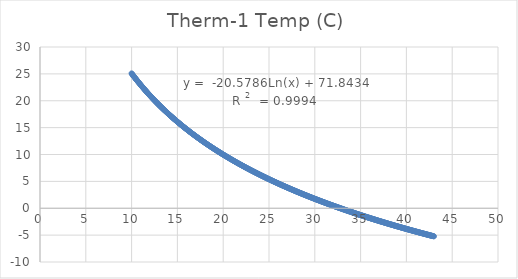
| Category | Therm-1 Temp (C)  |
|---|---|
| 10.0 | 25.089 |
| 10.05 | 24.975 |
| 10.1 | 24.862 |
| 10.15 | 24.75 |
| 10.2 | 24.638 |
| 10.25 | 24.527 |
| 10.3 | 24.417 |
| 10.35 | 24.307 |
| 10.4 | 24.197 |
| 10.45 | 24.089 |
| 10.5 | 23.98 |
| 10.55 | 23.873 |
| 10.6 | 23.766 |
| 10.65 | 23.659 |
| 10.7 | 23.554 |
| 10.75 | 23.448 |
| 10.8 | 23.344 |
| 10.85 | 23.239 |
| 10.9 | 23.136 |
| 10.95 | 23.033 |
| 11.0 | 22.93 |
| 11.05 | 22.828 |
| 11.1 | 22.726 |
| 11.15 | 22.625 |
| 11.2 | 22.525 |
| 11.25 | 22.425 |
| 11.3 | 22.325 |
| 11.35 | 22.226 |
| 11.4 | 22.128 |
| 11.45 | 22.03 |
| 11.5 | 21.932 |
| 11.55 | 21.835 |
| 11.6 | 21.739 |
| 11.65 | 21.643 |
| 11.7 | 21.547 |
| 11.75 | 21.452 |
| 11.8 | 21.357 |
| 11.85 | 21.263 |
| 11.9 | 21.169 |
| 11.95 | 21.076 |
| 12.0 | 20.983 |
| 12.05 | 20.89 |
| 12.1 | 20.798 |
| 12.15 | 20.706 |
| 12.2 | 20.615 |
| 12.25 | 20.524 |
| 12.3 | 20.434 |
| 12.35 | 20.344 |
| 12.4 | 20.255 |
| 12.45 | 20.165 |
| 12.5 | 20.077 |
| 12.55 | 19.988 |
| 12.6 | 19.9 |
| 12.65 | 19.813 |
| 12.7 | 19.726 |
| 12.75 | 19.639 |
| 12.8 | 19.553 |
| 12.85 | 19.467 |
| 12.9 | 19.381 |
| 12.95 | 19.296 |
| 13.0 | 19.211 |
| 13.05 | 19.126 |
| 13.1 | 19.042 |
| 13.15 | 18.958 |
| 13.2 | 18.875 |
| 13.25 | 18.792 |
| 13.3 | 18.709 |
| 13.35 | 18.627 |
| 13.4 | 18.545 |
| 13.45 | 18.463 |
| 13.5 | 18.382 |
| 13.55 | 18.301 |
| 13.6 | 18.22 |
| 13.65 | 18.14 |
| 13.7 | 18.06 |
| 13.75 | 17.98 |
| 13.8 | 17.901 |
| 13.85 | 17.822 |
| 13.9 | 17.743 |
| 13.95 | 17.665 |
| 14.0 | 17.587 |
| 14.05 | 17.509 |
| 14.1 | 17.432 |
| 14.15 | 17.355 |
| 14.2 | 17.278 |
| 14.25 | 17.201 |
| 14.3 | 17.125 |
| 14.35 | 17.049 |
| 14.4 | 16.974 |
| 14.45 | 16.898 |
| 14.5 | 16.823 |
| 14.55 | 16.749 |
| 14.6 | 16.674 |
| 14.65 | 16.6 |
| 14.7 | 16.526 |
| 14.75 | 16.453 |
| 14.8 | 16.379 |
| 14.85 | 16.306 |
| 14.9 | 16.234 |
| 14.95 | 16.161 |
| 15.0 | 16.089 |
| 15.05 | 16.017 |
| 15.1 | 15.945 |
| 15.15 | 15.874 |
| 15.2 | 15.803 |
| 15.25 | 15.732 |
| 15.3 | 15.662 |
| 15.35 | 15.591 |
| 15.4 | 15.521 |
| 15.45 | 15.451 |
| 15.5 | 15.382 |
| 15.55 | 15.313 |
| 15.6 | 15.244 |
| 15.65 | 15.175 |
| 15.7 | 15.106 |
| 15.75 | 15.038 |
| 15.8 | 14.97 |
| 15.85 | 14.902 |
| 15.9 | 14.834 |
| 15.95 | 14.767 |
| 16.0 | 14.7 |
| 16.05 | 14.633 |
| 16.1 | 14.567 |
| 16.15 | 14.5 |
| 16.2 | 14.434 |
| 16.25 | 14.368 |
| 16.3 | 14.302 |
| 16.35 | 14.237 |
| 16.4 | 14.172 |
| 16.45 | 14.107 |
| 16.5 | 14.042 |
| 16.55 | 13.977 |
| 16.6 | 13.913 |
| 16.65 | 13.849 |
| 16.7 | 13.785 |
| 16.75 | 13.721 |
| 16.8 | 13.658 |
| 16.85 | 13.594 |
| 16.9 | 13.531 |
| 16.95 | 13.468 |
| 17.0 | 13.406 |
| 17.05 | 13.343 |
| 17.1 | 13.281 |
| 17.15 | 13.219 |
| 17.2 | 13.157 |
| 17.25 | 13.095 |
| 17.3 | 13.034 |
| 17.35 | 12.973 |
| 17.4 | 12.912 |
| 17.45 | 12.851 |
| 17.5 | 12.79 |
| 17.55 | 12.73 |
| 17.6 | 12.67 |
| 17.65 | 12.61 |
| 17.7 | 12.55 |
| 17.75 | 12.49 |
| 17.8 | 12.431 |
| 17.85 | 12.371 |
| 17.9 | 12.312 |
| 17.95 | 12.253 |
| 18.0 | 12.195 |
| 18.05 | 12.136 |
| 18.1 | 12.078 |
| 18.15 | 12.019 |
| 18.2 | 11.961 |
| 18.25 | 11.904 |
| 18.3 | 11.846 |
| 18.35 | 11.788 |
| 18.4 | 11.731 |
| 18.45 | 11.674 |
| 18.5 | 11.617 |
| 18.55 | 11.56 |
| 18.6 | 11.504 |
| 18.65 | 11.447 |
| 18.7 | 11.391 |
| 18.75 | 11.335 |
| 18.8 | 11.279 |
| 18.85 | 11.223 |
| 18.9 | 11.168 |
| 18.95 | 11.112 |
| 19.0 | 11.057 |
| 19.05 | 11.002 |
| 19.1 | 10.947 |
| 19.15 | 10.892 |
| 19.2 | 10.838 |
| 19.25 | 10.783 |
| 19.3 | 10.729 |
| 19.35 | 10.675 |
| 19.4 | 10.621 |
| 19.45 | 10.567 |
| 19.5 | 10.513 |
| 19.55 | 10.46 |
| 19.6 | 10.406 |
| 19.65 | 10.353 |
| 19.7 | 10.3 |
| 19.75 | 10.247 |
| 19.8 | 10.195 |
| 19.85 | 10.142 |
| 19.9 | 10.09 |
| 19.95 | 10.037 |
| 20.0 | 9.985 |
| 20.05 | 9.933 |
| 20.1 | 9.881 |
| 20.15 | 9.83 |
| 20.2 | 9.778 |
| 20.25 | 9.727 |
| 20.3 | 9.675 |
| 20.35 | 9.624 |
| 20.4 | 9.573 |
| 20.45 | 9.522 |
| 20.5 | 9.472 |
| 20.55 | 9.421 |
| 20.6 | 9.371 |
| 20.65 | 9.32 |
| 20.7 | 9.27 |
| 20.75 | 9.22 |
| 20.8 | 9.17 |
| 20.85 | 9.12 |
| 20.9 | 9.071 |
| 20.95 | 9.021 |
| 21.0 | 8.972 |
| 21.05 | 8.923 |
| 21.1 | 8.874 |
| 21.15 | 8.825 |
| 21.2 | 8.776 |
| 21.25 | 8.727 |
| 21.3 | 8.679 |
| 21.35 | 8.63 |
| 21.4 | 8.582 |
| 21.45 | 8.534 |
| 21.5 | 8.485 |
| 21.55 | 8.438 |
| 21.6 | 8.39 |
| 21.65 | 8.342 |
| 21.7 | 8.294 |
| 21.75 | 8.247 |
| 21.8 | 8.2 |
| 21.85 | 8.153 |
| 21.9 | 8.105 |
| 21.95 | 8.058 |
| 22.0 | 8.012 |
| 22.05 | 7.965 |
| 22.1 | 7.918 |
| 22.15 | 7.872 |
| 22.2 | 7.826 |
| 22.25 | 7.779 |
| 22.3 | 7.733 |
| 22.35 | 7.687 |
| 22.4 | 7.641 |
| 22.45 | 7.595 |
| 22.5 | 7.55 |
| 22.55 | 7.504 |
| 22.6 | 7.459 |
| 22.65 | 7.413 |
| 22.7 | 7.368 |
| 22.75 | 7.323 |
| 22.8 | 7.278 |
| 22.85 | 7.233 |
| 22.9 | 7.189 |
| 22.95 | 7.144 |
| 23.0 | 7.099 |
| 23.05 | 7.055 |
| 23.1 | 7.011 |
| 23.15 | 6.966 |
| 23.2 | 6.922 |
| 23.25 | 6.878 |
| 23.3 | 6.834 |
| 23.35 | 6.791 |
| 23.4 | 6.747 |
| 23.45 | 6.703 |
| 23.5 | 6.66 |
| 23.55 | 6.616 |
| 23.6 | 6.573 |
| 23.65 | 6.53 |
| 23.7 | 6.487 |
| 23.75 | 6.444 |
| 23.8 | 6.401 |
| 23.85 | 6.358 |
| 23.9 | 6.316 |
| 23.95 | 6.273 |
| 24.0 | 6.231 |
| 24.05 | 6.188 |
| 24.1 | 6.146 |
| 24.15 | 6.104 |
| 24.2 | 6.062 |
| 24.25 | 6.02 |
| 24.3 | 5.978 |
| 24.35 | 5.936 |
| 24.4 | 5.894 |
| 24.45 | 5.853 |
| 24.5 | 5.811 |
| 24.55 | 5.77 |
| 24.6 | 5.729 |
| 24.65 | 5.688 |
| 24.7 | 5.646 |
| 24.75 | 5.605 |
| 24.8 | 5.564 |
| 24.85 | 5.524 |
| 24.9 | 5.483 |
| 24.95 | 5.442 |
| 25.0 | 5.402 |
| 25.05 | 5.361 |
| 25.1 | 5.321 |
| 25.15 | 5.281 |
| 25.2 | 5.24 |
| 25.25 | 5.2 |
| 25.3 | 5.16 |
| 25.35 | 5.12 |
| 25.4 | 5.081 |
| 25.45 | 5.041 |
| 25.5 | 5.001 |
| 25.55 | 4.962 |
| 25.6 | 4.922 |
| 25.65 | 4.883 |
| 25.7 | 4.843 |
| 25.75 | 4.804 |
| 25.8 | 4.765 |
| 25.85 | 4.726 |
| 25.9 | 4.687 |
| 25.95 | 4.648 |
| 26.0 | 4.609 |
| 26.05 | 4.571 |
| 26.1 | 4.532 |
| 26.15 | 4.493 |
| 26.2 | 4.455 |
| 26.25 | 4.417 |
| 26.3 | 4.378 |
| 26.35 | 4.34 |
| 26.4 | 4.302 |
| 26.45 | 4.264 |
| 26.5 | 4.226 |
| 26.55 | 4.188 |
| 26.6 | 4.15 |
| 26.65 | 4.112 |
| 26.7 | 4.075 |
| 26.75 | 4.037 |
| 26.8 | 4 |
| 26.85 | 3.962 |
| 26.9 | 3.925 |
| 26.95 | 3.888 |
| 27.0 | 3.85 |
| 27.05 | 3.813 |
| 27.1 | 3.776 |
| 27.15 | 3.739 |
| 27.2 | 3.702 |
| 27.25 | 3.666 |
| 27.3 | 3.629 |
| 27.35 | 3.592 |
| 27.4 | 3.556 |
| 27.45 | 3.519 |
| 27.5 | 3.483 |
| 27.55 | 3.446 |
| 27.6 | 3.41 |
| 27.65 | 3.374 |
| 27.7 | 3.338 |
| 27.75 | 3.302 |
| 27.8 | 3.266 |
| 27.85 | 3.23 |
| 27.9 | 3.194 |
| 27.95 | 3.158 |
| 28.0 | 3.122 |
| 28.05 | 3.087 |
| 28.1 | 3.051 |
| 28.15 | 3.016 |
| 28.2 | 2.98 |
| 28.25 | 2.945 |
| 28.3 | 2.91 |
| 28.35 | 2.875 |
| 28.4 | 2.839 |
| 28.45 | 2.804 |
| 28.5 | 2.769 |
| 28.55 | 2.734 |
| 28.6 | 2.7 |
| 28.65 | 2.665 |
| 28.7 | 2.63 |
| 28.75 | 2.595 |
| 28.8 | 2.561 |
| 28.85 | 2.526 |
| 28.9 | 2.492 |
| 28.95 | 2.458 |
| 29.0 | 2.423 |
| 29.05 | 2.389 |
| 29.1 | 2.355 |
| 29.15 | 2.321 |
| 29.2 | 2.287 |
| 29.25 | 2.253 |
| 29.3 | 2.219 |
| 29.35 | 2.185 |
| 29.4 | 2.151 |
| 29.45 | 2.117 |
| 29.5 | 2.084 |
| 29.55 | 2.05 |
| 29.6 | 2.017 |
| 29.65 | 1.983 |
| 29.7 | 1.95 |
| 29.75 | 1.916 |
| 29.8 | 1.883 |
| 29.85 | 1.85 |
| 29.9 | 1.817 |
| 29.95 | 1.784 |
| 30.0 | 1.751 |
| 30.05 | 1.718 |
| 30.1 | 1.685 |
| 30.15 | 1.652 |
| 30.2 | 1.619 |
| 30.25 | 1.586 |
| 30.3 | 1.554 |
| 30.35 | 1.521 |
| 30.4 | 1.488 |
| 30.45 | 1.456 |
| 30.5 | 1.424 |
| 30.55 | 1.391 |
| 30.6 | 1.359 |
| 30.65 | 1.327 |
| 30.7 | 1.294 |
| 30.75 | 1.262 |
| 30.8 | 1.23 |
| 30.85 | 1.198 |
| 30.9 | 1.166 |
| 30.95 | 1.134 |
| 31.0 | 1.103 |
| 31.05 | 1.071 |
| 31.1 | 1.039 |
| 31.15 | 1.007 |
| 31.2 | 0.976 |
| 31.25 | 0.944 |
| 31.3 | 0.913 |
| 31.35 | 0.881 |
| 31.4 | 0.85 |
| 31.45 | 0.819 |
| 31.5 | 0.787 |
| 31.55 | 0.756 |
| 31.6 | 0.725 |
| 31.65 | 0.694 |
| 31.7 | 0.663 |
| 31.75 | 0.632 |
| 31.8 | 0.601 |
| 31.85 | 0.57 |
| 31.9 | 0.539 |
| 31.95 | 0.508 |
| 32.0 | 0.478 |
| 32.05 | 0.447 |
| 32.1 | 0.416 |
| 32.15 | 0.386 |
| 32.2 | 0.355 |
| 32.25 | 0.325 |
| 32.3 | 0.294 |
| 32.35 | 0.264 |
| 32.4 | 0.234 |
| 32.45 | 0.204 |
| 32.5 | 0.173 |
| 32.55 | 0.143 |
| 32.6 | 0.113 |
| 32.65 | 0.083 |
| 32.7 | 0.053 |
| 32.75 | 0.023 |
| 32.8 | -0.007 |
| 32.85 | -0.037 |
| 32.9 | -0.066 |
| 32.95 | -0.096 |
| 33.0 | -0.126 |
| 33.05 | -0.155 |
| 33.1 | -0.185 |
| 33.15 | -0.215 |
| 33.2 | -0.244 |
| 33.25 | -0.273 |
| 33.3 | -0.303 |
| 33.35 | -0.332 |
| 33.4 | -0.361 |
| 33.45 | -0.391 |
| 33.5 | -0.42 |
| 33.55 | -0.449 |
| 33.6 | -0.478 |
| 33.65 | -0.507 |
| 33.7 | -0.536 |
| 33.75 | -0.565 |
| 33.8 | -0.594 |
| 33.85 | -0.623 |
| 33.9 | -0.652 |
| 33.95 | -0.68 |
| 34.0 | -0.709 |
| 34.05 | -0.738 |
| 34.1 | -0.766 |
| 34.15 | -0.795 |
| 34.2 | -0.823 |
| 34.25 | -0.852 |
| 34.3 | -0.88 |
| 34.35 | -0.909 |
| 34.4 | -0.937 |
| 34.45 | -0.965 |
| 34.5 | -0.993 |
| 34.55 | -1.022 |
| 34.6 | -1.05 |
| 34.65 | -1.078 |
| 34.7 | -1.106 |
| 34.75 | -1.134 |
| 34.8 | -1.162 |
| 34.85 | -1.19 |
| 34.9 | -1.218 |
| 34.95 | -1.245 |
| 35.0 | -1.273 |
| 35.05 | -1.301 |
| 35.1 | -1.329 |
| 35.15 | -1.356 |
| 35.2 | -1.384 |
| 35.25 | -1.411 |
| 35.3 | -1.439 |
| 35.35 | -1.466 |
| 35.4 | -1.494 |
| 35.45 | -1.521 |
| 35.5 | -1.549 |
| 35.55 | -1.576 |
| 35.6 | -1.603 |
| 35.65 | -1.63 |
| 35.7 | -1.658 |
| 35.75 | -1.685 |
| 35.8 | -1.712 |
| 35.85 | -1.739 |
| 35.9 | -1.766 |
| 35.95 | -1.793 |
| 36.0 | -1.82 |
| 36.05 | -1.847 |
| 36.1 | -1.873 |
| 36.15 | -1.9 |
| 36.2 | -1.927 |
| 36.25 | -1.954 |
| 36.3 | -1.98 |
| 36.35 | -2.007 |
| 36.4 | -2.034 |
| 36.45 | -2.06 |
| 36.5 | -2.087 |
| 36.55 | -2.113 |
| 36.6 | -2.139 |
| 36.65 | -2.166 |
| 36.7 | -2.192 |
| 36.75 | -2.218 |
| 36.8 | -2.245 |
| 36.85 | -2.271 |
| 36.9 | -2.297 |
| 36.95 | -2.323 |
| 37.0 | -2.349 |
| 37.05 | -2.375 |
| 37.1 | -2.401 |
| 37.15 | -2.427 |
| 37.2 | -2.453 |
| 37.25 | -2.479 |
| 37.3 | -2.505 |
| 37.35 | -2.531 |
| 37.4 | -2.557 |
| 37.45 | -2.583 |
| 37.5 | -2.608 |
| 37.55 | -2.634 |
| 37.6 | -2.66 |
| 37.65 | -2.685 |
| 37.7 | -2.711 |
| 37.75 | -2.736 |
| 37.8 | -2.762 |
| 37.85 | -2.787 |
| 37.9 | -2.813 |
| 37.95 | -2.838 |
| 38.0 | -2.863 |
| 38.05 | -2.889 |
| 38.1 | -2.914 |
| 38.15 | -2.939 |
| 38.2 | -2.964 |
| 38.25 | -2.989 |
| 38.3 | -3.014 |
| 38.35 | -3.04 |
| 38.4 | -3.065 |
| 38.45 | -3.09 |
| 38.5 | -3.115 |
| 38.55 | -3.139 |
| 38.6 | -3.164 |
| 38.65 | -3.189 |
| 38.7 | -3.214 |
| 38.75 | -3.239 |
| 38.8 | -3.264 |
| 38.85 | -3.288 |
| 38.9 | -3.313 |
| 38.95 | -3.338 |
| 39.0 | -3.362 |
| 39.05 | -3.387 |
| 39.1 | -3.411 |
| 39.15 | -3.436 |
| 39.2 | -3.46 |
| 39.25 | -3.485 |
| 39.3 | -3.509 |
| 39.35 | -3.533 |
| 39.4 | -3.558 |
| 39.45 | -3.582 |
| 39.5 | -3.606 |
| 39.55 | -3.631 |
| 39.6 | -3.655 |
| 39.65 | -3.679 |
| 39.7 | -3.703 |
| 39.75 | -3.727 |
| 39.8 | -3.751 |
| 39.85 | -3.775 |
| 39.9 | -3.799 |
| 39.95 | -3.823 |
| 40.0 | -3.847 |
| 40.05 | -3.871 |
| 40.1 | -3.895 |
| 40.15 | -3.919 |
| 40.2 | -3.942 |
| 40.25 | -3.966 |
| 40.3 | -3.99 |
| 40.35 | -4.013 |
| 40.4 | -4.037 |
| 40.45 | -4.061 |
| 40.5 | -4.084 |
| 40.55 | -4.108 |
| 40.6 | -4.131 |
| 40.65 | -4.155 |
| 40.7 | -4.178 |
| 40.75 | -4.202 |
| 40.8 | -4.225 |
| 40.85 | -4.249 |
| 40.9 | -4.272 |
| 40.95 | -4.295 |
| 41.0 | -4.318 |
| 41.05 | -4.342 |
| 41.1 | -4.365 |
| 41.15 | -4.388 |
| 41.2 | -4.411 |
| 41.25 | -4.434 |
| 41.3 | -4.457 |
| 41.35 | -4.48 |
| 41.4 | -4.503 |
| 41.45 | -4.526 |
| 41.5 | -4.549 |
| 41.55 | -4.572 |
| 41.6 | -4.595 |
| 41.65 | -4.618 |
| 41.7 | -4.641 |
| 41.75 | -4.664 |
| 41.8 | -4.686 |
| 41.85 | -4.709 |
| 41.9 | -4.732 |
| 41.95 | -4.754 |
| 42.0 | -4.777 |
| 42.05 | -4.8 |
| 42.1 | -4.822 |
| 42.15 | -4.845 |
| 42.2 | -4.867 |
| 42.25 | -4.89 |
| 42.3 | -4.912 |
| 42.35 | -4.935 |
| 42.4 | -4.957 |
| 42.45 | -4.98 |
| 42.5 | -5.002 |
| 42.55 | -5.024 |
| 42.6 | -5.047 |
| 42.65 | -5.069 |
| 42.7 | -5.091 |
| 42.75 | -5.113 |
| 42.8 | -5.135 |
| 42.85 | -5.157 |
| 42.9 | -5.18 |
| 42.95 | -5.202 |
| 43.0 | -5.224 |